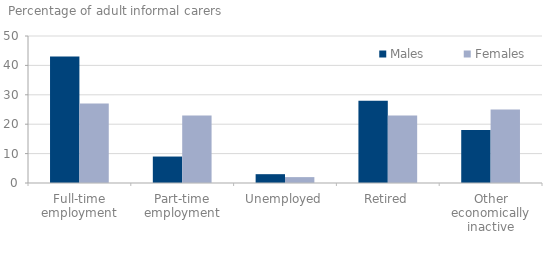
| Category | Males | Females |
|---|---|---|
| 0 | 43 | 27 |
| 1 | 9 | 23 |
| 2 | 3 | 2 |
| 3 | 28 | 23 |
| 4 | 18 | 25 |